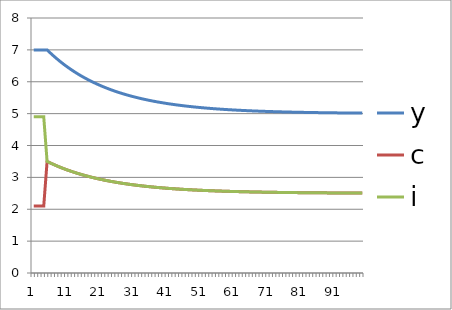
| Category | y | c | i |
|---|---|---|---|
| 0 | 7 | 2.1 | 4.9 |
| 1 | 7 | 2.1 | 4.9 |
| 2 | 7 | 2.1 | 4.9 |
| 3 | 7 | 2.1 | 4.9 |
| 4 | 7 | 3.5 | 3.5 |
| 5 | 6.899 | 3.45 | 3.45 |
| 6 | 6.804 | 3.402 | 3.402 |
| 7 | 6.713 | 3.356 | 3.356 |
| 8 | 6.627 | 3.313 | 3.313 |
| 9 | 6.545 | 3.272 | 3.272 |
| 10 | 6.467 | 3.234 | 3.234 |
| 11 | 6.393 | 3.197 | 3.197 |
| 12 | 6.323 | 3.162 | 3.162 |
| 13 | 6.257 | 3.128 | 3.128 |
| 14 | 6.194 | 3.097 | 3.097 |
| 15 | 6.134 | 3.067 | 3.067 |
| 16 | 6.077 | 3.038 | 3.038 |
| 17 | 6.023 | 3.011 | 3.011 |
| 18 | 5.971 | 2.986 | 2.986 |
| 19 | 5.923 | 2.961 | 2.961 |
| 20 | 5.876 | 2.938 | 2.938 |
| 21 | 5.832 | 2.916 | 2.916 |
| 22 | 5.79 | 2.895 | 2.895 |
| 23 | 5.751 | 2.875 | 2.875 |
| 24 | 5.713 | 2.857 | 2.857 |
| 25 | 5.677 | 2.839 | 2.839 |
| 26 | 5.643 | 2.822 | 2.822 |
| 27 | 5.611 | 2.806 | 2.806 |
| 28 | 5.581 | 2.79 | 2.79 |
| 29 | 5.551 | 2.776 | 2.776 |
| 30 | 5.524 | 2.762 | 2.762 |
| 31 | 5.498 | 2.749 | 2.749 |
| 32 | 5.473 | 2.736 | 2.736 |
| 33 | 5.449 | 2.724 | 2.724 |
| 34 | 5.426 | 2.713 | 2.713 |
| 35 | 5.405 | 2.703 | 2.703 |
| 36 | 5.385 | 2.692 | 2.692 |
| 37 | 5.365 | 2.683 | 2.683 |
| 38 | 5.347 | 2.674 | 2.674 |
| 39 | 5.33 | 2.665 | 2.665 |
| 40 | 5.313 | 2.657 | 2.657 |
| 41 | 5.298 | 2.649 | 2.649 |
| 42 | 5.283 | 2.641 | 2.641 |
| 43 | 5.269 | 2.634 | 2.634 |
| 44 | 5.255 | 2.628 | 2.628 |
| 45 | 5.242 | 2.621 | 2.621 |
| 46 | 5.23 | 2.615 | 2.615 |
| 47 | 5.219 | 2.609 | 2.609 |
| 48 | 5.208 | 2.604 | 2.604 |
| 49 | 5.197 | 2.599 | 2.599 |
| 50 | 5.187 | 2.594 | 2.594 |
| 51 | 5.178 | 2.589 | 2.589 |
| 52 | 5.169 | 2.585 | 2.585 |
| 53 | 5.161 | 2.58 | 2.58 |
| 54 | 5.153 | 2.576 | 2.576 |
| 55 | 5.145 | 2.573 | 2.573 |
| 56 | 5.138 | 2.569 | 2.569 |
| 57 | 5.131 | 2.565 | 2.565 |
| 58 | 5.124 | 2.562 | 2.562 |
| 59 | 5.118 | 2.559 | 2.559 |
| 60 | 5.112 | 2.556 | 2.556 |
| 61 | 5.107 | 2.553 | 2.553 |
| 62 | 5.101 | 2.551 | 2.551 |
| 63 | 5.096 | 2.548 | 2.548 |
| 64 | 5.091 | 2.546 | 2.546 |
| 65 | 5.087 | 2.543 | 2.543 |
| 66 | 5.082 | 2.541 | 2.541 |
| 67 | 5.078 | 2.539 | 2.539 |
| 68 | 5.074 | 2.537 | 2.537 |
| 69 | 5.071 | 2.535 | 2.535 |
| 70 | 5.067 | 2.534 | 2.534 |
| 71 | 5.064 | 2.532 | 2.532 |
| 72 | 5.061 | 2.53 | 2.53 |
| 73 | 5.058 | 2.529 | 2.529 |
| 74 | 5.055 | 2.527 | 2.527 |
| 75 | 5.052 | 2.526 | 2.526 |
| 76 | 5.049 | 2.525 | 2.525 |
| 77 | 5.047 | 2.523 | 2.523 |
| 78 | 5.045 | 2.522 | 2.522 |
| 79 | 5.042 | 2.521 | 2.521 |
| 80 | 5.04 | 2.52 | 2.52 |
| 81 | 5.038 | 2.519 | 2.519 |
| 82 | 5.036 | 2.518 | 2.518 |
| 83 | 5.034 | 2.517 | 2.517 |
| 84 | 5.033 | 2.516 | 2.516 |
| 85 | 5.031 | 2.516 | 2.516 |
| 86 | 5.03 | 2.515 | 2.515 |
| 87 | 5.028 | 2.514 | 2.514 |
| 88 | 5.027 | 2.513 | 2.513 |
| 89 | 5.025 | 2.513 | 2.513 |
| 90 | 5.024 | 2.512 | 2.512 |
| 91 | 5.023 | 2.511 | 2.511 |
| 92 | 5.022 | 2.511 | 2.511 |
| 93 | 5.021 | 2.51 | 2.51 |
| 94 | 5.02 | 2.51 | 2.51 |
| 95 | 5.019 | 2.509 | 2.509 |
| 96 | 5.018 | 2.509 | 2.509 |
| 97 | 5.017 | 2.508 | 2.508 |
| 98 | 5.016 | 2.508 | 2.508 |